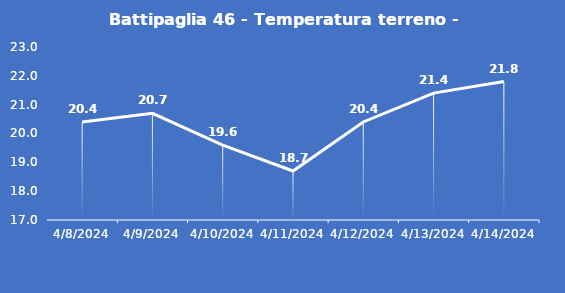
| Category | Battipaglia 46 - Temperatura terreno - Max (°C) |
|---|---|
| 4/8/24 | 20.4 |
| 4/9/24 | 20.7 |
| 4/10/24 | 19.6 |
| 4/11/24 | 18.7 |
| 4/12/24 | 20.4 |
| 4/13/24 | 21.4 |
| 4/14/24 | 21.8 |